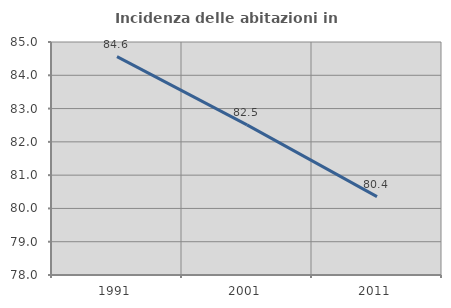
| Category | Incidenza delle abitazioni in proprietà  |
|---|---|
| 1991.0 | 84.56 |
| 2001.0 | 82.509 |
| 2011.0 | 80.356 |